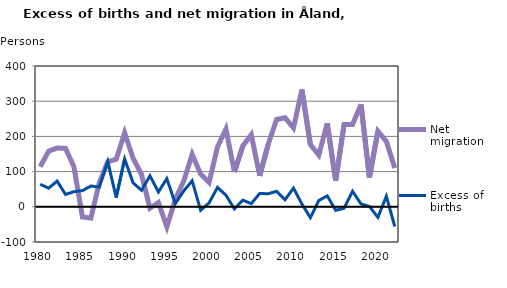
| Category | Net migration | Excess of births |
|---|---|---|
| 1980.0 | 114 | 64 |
| 1981.0 | 158 | 53 |
| 1982.0 | 167 | 73 |
| 1983.0 | 166 | 35 |
| 1984.0 | 113 | 43 |
| 1985.0 | -29 | 46 |
| 1986.0 | -32 | 59 |
| 1987.0 | 68 | 56 |
| 1988.0 | 128 | 129 |
| 1989.0 | 135 | 26 |
| 1990.0 | 210 | 136 |
| 1991.0 | 138 | 68 |
| 1992.0 | 92 | 47 |
| 1993.0 | -4 | 88 |
| 1994.0 | 12 | 42 |
| 1995.0 | -57 | 80 |
| 1996.0 | 21 | 9 |
| 1997.0 | 73 | 45 |
| 1998.0 | 149 | 74 |
| 1999.0 | 93 | -10 |
| 2000.0 | 69 | 11 |
| 2001.0 | 170 | 55 |
| 2002.0 | 221 | 33 |
| 2003.0 | 99 | -6 |
| 2004.0 | 173 | 19 |
| 2005.0 | 205 | 9 |
| 2006.0 | 88 | 38 |
| 2007.0 | 177 | 37 |
| 2008.0 | 248 | 44 |
| 2009.0 | 253 | 20 |
| 2010.0 | 224 | 53 |
| 2011.0 | 333 | 8 |
| 2012.0 | 177 | -31 |
| 2013.0 | 147 | 18 |
| 2014.0 | 237 | 31 |
| 2015.0 | 74 | -10 |
| 2016.0 | 234 | -4 |
| 2017.0 | 234 | 44 |
| 2018.0 | 291 | 8 |
| 2019.0 | 83 | 1 |
| 2020.0 | 215 | -30 |
| 2021.0 | 186 | 30 |
| 2022.0 | 110 | -56 |